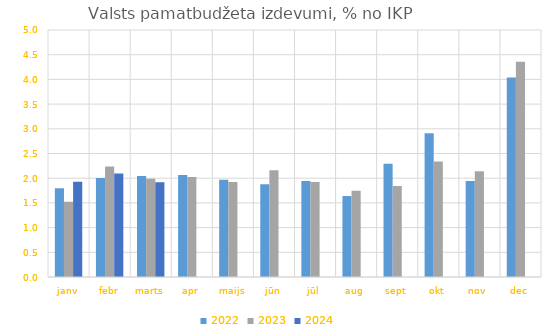
| Category | 2022 | 2023 | 2024 |
|---|---|---|---|
| janv | 1.796 | 1.523 | 1.928 |
| febr | 2.004 | 2.238 | 2.094 |
| marts | 2.044 | 1.987 | 1.918 |
| apr | 2.064 | 2.022 | 0 |
| maijs | 1.97 | 1.922 | 0 |
| jūn | 1.88 | 2.162 | 0 |
| jūl | 1.943 | 1.921 | 0 |
| aug | 1.639 | 1.746 | 0 |
| sept | 2.291 | 1.842 | 0 |
| okt | 2.911 | 2.338 | 0 |
| nov | 1.942 | 2.143 | 0 |
| dec | 4.039 | 4.356 | 0 |